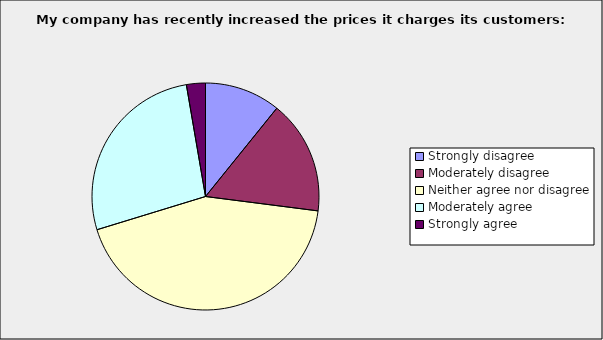
| Category | Series 0 |
|---|---|
| Strongly disagree | 0.108 |
| Moderately disagree | 0.162 |
| Neither agree nor disagree | 0.432 |
| Moderately agree | 0.27 |
| Strongly agree | 0.027 |